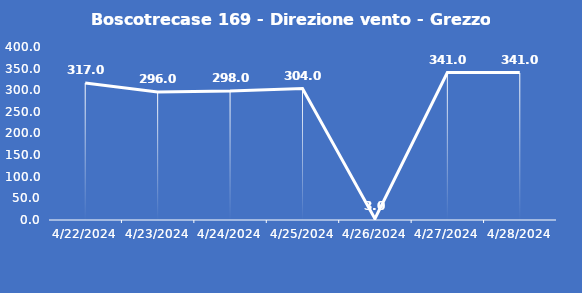
| Category | Boscotrecase 169 - Direzione vento - Grezzo (°N) |
|---|---|
| 4/22/24 | 317 |
| 4/23/24 | 296 |
| 4/24/24 | 298 |
| 4/25/24 | 304 |
| 4/26/24 | 3 |
| 4/27/24 | 341 |
| 4/28/24 | 341 |